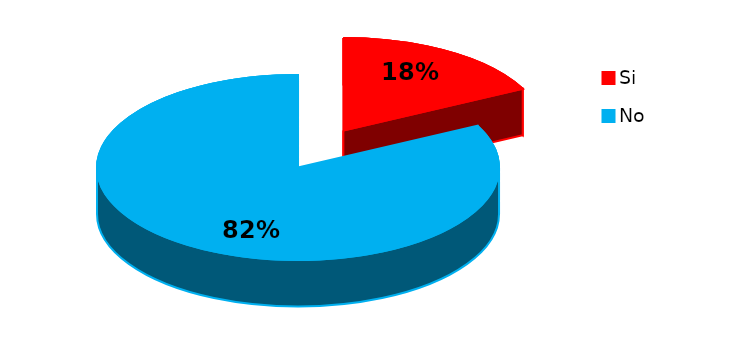
| Category | Series 0 |
|---|---|
| 0 | 10 |
| 1 | 47 |